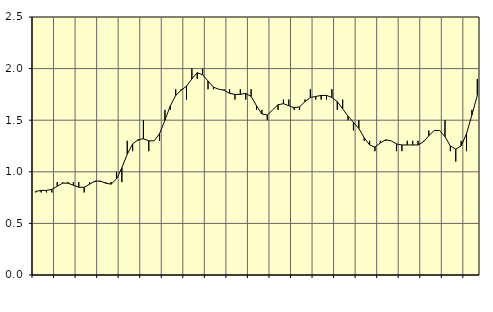
| Category | Piggar | Sysselsatta utomlands1 |
|---|---|---|
| nan | 0.8 | 0.81 |
| 1.0 | 0.8 | 0.82 |
| 1.0 | 0.8 | 0.82 |
| 1.0 | 0.8 | 0.83 |
| nan | 0.9 | 0.86 |
| 2.0 | 0.9 | 0.89 |
| 2.0 | 0.9 | 0.89 |
| 2.0 | 0.9 | 0.87 |
| nan | 0.9 | 0.85 |
| 3.0 | 0.8 | 0.85 |
| 3.0 | 0.9 | 0.88 |
| 3.0 | 0.9 | 0.91 |
| nan | 0.9 | 0.91 |
| 4.0 | 0.9 | 0.89 |
| 4.0 | 0.9 | 0.88 |
| 4.0 | 1 | 0.93 |
| nan | 0.9 | 1.04 |
| 5.0 | 1.3 | 1.17 |
| 5.0 | 1.2 | 1.27 |
| 5.0 | 1.3 | 1.31 |
| nan | 1.5 | 1.32 |
| 6.0 | 1.2 | 1.3 |
| 6.0 | 1.3 | 1.3 |
| 6.0 | 1.3 | 1.37 |
| nan | 1.6 | 1.5 |
| 7.0 | 1.6 | 1.64 |
| 7.0 | 1.8 | 1.74 |
| 7.0 | 1.8 | 1.79 |
| nan | 1.7 | 1.83 |
| 8.0 | 2 | 1.9 |
| 8.0 | 1.9 | 1.96 |
| 8.0 | 2 | 1.94 |
| nan | 1.8 | 1.88 |
| 9.0 | 1.8 | 1.82 |
| 9.0 | 1.8 | 1.8 |
| 9.0 | 1.8 | 1.79 |
| nan | 1.8 | 1.76 |
| 10.0 | 1.7 | 1.75 |
| 10.0 | 1.8 | 1.75 |
| 10.0 | 1.7 | 1.76 |
| nan | 1.8 | 1.73 |
| 11.0 | 1.6 | 1.64 |
| 11.0 | 1.6 | 1.56 |
| 11.0 | 1.5 | 1.55 |
| nan | 1.6 | 1.6 |
| 12.0 | 1.6 | 1.65 |
| 12.0 | 1.7 | 1.66 |
| 12.0 | 1.7 | 1.64 |
| nan | 1.6 | 1.62 |
| 13.0 | 1.6 | 1.63 |
| 13.0 | 1.7 | 1.68 |
| 13.0 | 1.8 | 1.72 |
| nan | 1.7 | 1.73 |
| 14.0 | 1.7 | 1.74 |
| 14.0 | 1.7 | 1.74 |
| 14.0 | 1.8 | 1.72 |
| nan | 1.6 | 1.68 |
| 15.0 | 1.7 | 1.61 |
| 15.0 | 1.5 | 1.54 |
| 15.0 | 1.4 | 1.48 |
| nan | 1.5 | 1.42 |
| 16.0 | 1.3 | 1.33 |
| 16.0 | 1.3 | 1.26 |
| 16.0 | 1.2 | 1.24 |
| nan | 1.3 | 1.28 |
| 17.0 | 1.3 | 1.31 |
| 17.0 | 1.3 | 1.3 |
| 17.0 | 1.2 | 1.27 |
| nan | 1.2 | 1.26 |
| 18.0 | 1.3 | 1.26 |
| 18.0 | 1.3 | 1.26 |
| 18.0 | 1.3 | 1.26 |
| nan | 1.3 | 1.29 |
| 19.0 | 1.4 | 1.35 |
| 19.0 | 1.4 | 1.4 |
| 19.0 | 1.4 | 1.4 |
| nan | 1.5 | 1.34 |
| 20.0 | 1.2 | 1.25 |
| 20.0 | 1.1 | 1.22 |
| 20.0 | 1.3 | 1.25 |
| nan | 1.2 | 1.37 |
| 21.0 | 1.6 | 1.55 |
| 21.0 | 1.9 | 1.74 |